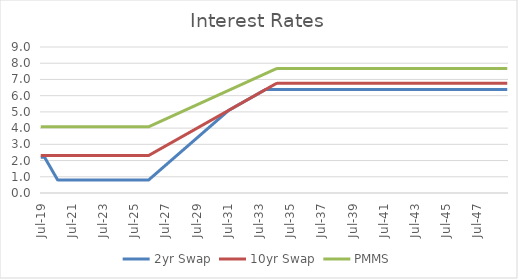
| Category | 2yr Swap | 10yr Swap | PMMS |
|---|---|---|---|
| 2019-07-31 | 2.207 | 2.308 | 4.08 |
| 2019-08-31 | 2.207 | 2.308 | 4.08 |
| 2019-09-30 | 2.207 | 2.308 | 4.08 |
| 2019-10-31 | 2.207 | 2.308 | 4.08 |
| 2019-11-30 | 2.068 | 2.308 | 4.08 |
| 2019-12-31 | 1.928 | 2.308 | 4.08 |
| 2020-01-31 | 1.789 | 2.308 | 4.08 |
| 2020-02-29 | 1.65 | 2.308 | 4.08 |
| 2020-03-31 | 1.51 | 2.308 | 4.08 |
| 2020-04-30 | 1.371 | 2.308 | 4.079 |
| 2020-05-31 | 1.232 | 2.308 | 4.079 |
| 2020-06-30 | 1.092 | 2.308 | 4.079 |
| 2020-07-31 | 0.953 | 2.308 | 4.079 |
| 2020-08-31 | 0.814 | 2.308 | 4.079 |
| 2020-09-30 | 0.798 | 2.308 | 4.079 |
| 2020-10-31 | 0.798 | 2.308 | 4.079 |
| 2020-11-30 | 0.798 | 2.308 | 4.079 |
| 2020-12-31 | 0.798 | 2.308 | 4.079 |
| 2021-01-31 | 0.798 | 2.308 | 4.079 |
| 2021-02-28 | 0.798 | 2.308 | 4.079 |
| 2021-03-31 | 0.798 | 2.308 | 4.079 |
| 2021-04-30 | 0.798 | 2.308 | 4.079 |
| 2021-05-31 | 0.798 | 2.308 | 4.079 |
| 2021-06-30 | 0.798 | 2.308 | 4.079 |
| 2021-07-31 | 0.798 | 2.308 | 4.079 |
| 2021-08-31 | 0.798 | 2.308 | 4.079 |
| 2021-09-30 | 0.798 | 2.308 | 4.079 |
| 2021-10-31 | 0.798 | 2.308 | 4.079 |
| 2021-11-30 | 0.798 | 2.308 | 4.079 |
| 2021-12-31 | 0.798 | 2.308 | 4.079 |
| 2022-01-31 | 0.798 | 2.308 | 4.079 |
| 2022-02-28 | 0.798 | 2.308 | 4.079 |
| 2022-03-31 | 0.798 | 2.308 | 4.079 |
| 2022-04-30 | 0.798 | 2.308 | 4.079 |
| 2022-05-31 | 0.798 | 2.308 | 4.079 |
| 2022-06-30 | 0.798 | 2.308 | 4.079 |
| 2022-07-31 | 0.798 | 2.308 | 4.079 |
| 2022-08-31 | 0.798 | 2.308 | 4.079 |
| 2022-09-30 | 0.798 | 2.308 | 4.079 |
| 2022-10-31 | 0.798 | 2.308 | 4.079 |
| 2022-11-30 | 0.798 | 2.308 | 4.079 |
| 2022-12-31 | 0.798 | 2.308 | 4.079 |
| 2023-01-31 | 0.798 | 2.308 | 4.079 |
| 2023-02-28 | 0.798 | 2.308 | 4.079 |
| 2023-03-31 | 0.798 | 2.308 | 4.079 |
| 2023-04-30 | 0.798 | 2.308 | 4.079 |
| 2023-05-31 | 0.798 | 2.308 | 4.079 |
| 2023-06-30 | 0.798 | 2.308 | 4.079 |
| 2023-07-31 | 0.798 | 2.308 | 4.079 |
| 2023-08-31 | 0.798 | 2.308 | 4.079 |
| 2023-09-30 | 0.798 | 2.308 | 4.079 |
| 2023-10-31 | 0.798 | 2.308 | 4.079 |
| 2023-11-30 | 0.798 | 2.308 | 4.079 |
| 2023-12-31 | 0.798 | 2.308 | 4.079 |
| 2024-01-31 | 0.798 | 2.308 | 4.079 |
| 2024-02-29 | 0.798 | 2.308 | 4.079 |
| 2024-03-31 | 0.798 | 2.308 | 4.079 |
| 2024-04-30 | 0.798 | 2.308 | 4.079 |
| 2024-05-31 | 0.798 | 2.308 | 4.079 |
| 2024-06-30 | 0.798 | 2.308 | 4.079 |
| 2024-07-31 | 0.798 | 2.308 | 4.079 |
| 2024-08-31 | 0.798 | 2.308 | 4.079 |
| 2024-09-30 | 0.798 | 2.308 | 4.079 |
| 2024-10-31 | 0.798 | 2.308 | 4.079 |
| 2024-11-30 | 0.798 | 2.308 | 4.079 |
| 2024-12-31 | 0.798 | 2.308 | 4.079 |
| 2025-01-31 | 0.798 | 2.308 | 4.079 |
| 2025-02-28 | 0.798 | 2.308 | 4.079 |
| 2025-03-31 | 0.798 | 2.308 | 4.079 |
| 2025-04-30 | 0.798 | 2.308 | 4.079 |
| 2025-05-31 | 0.798 | 2.308 | 4.079 |
| 2025-06-30 | 0.798 | 2.308 | 4.079 |
| 2025-07-31 | 0.798 | 2.308 | 4.079 |
| 2025-08-31 | 0.798 | 2.308 | 4.079 |
| 2025-09-30 | 0.798 | 2.308 | 4.079 |
| 2025-10-31 | 0.798 | 2.308 | 4.079 |
| 2025-11-30 | 0.798 | 2.308 | 4.079 |
| 2025-12-31 | 0.798 | 2.308 | 4.079 |
| 2026-01-31 | 0.798 | 2.308 | 4.079 |
| 2026-02-28 | 0.798 | 2.308 | 4.079 |
| 2026-03-31 | 0.798 | 2.308 | 4.079 |
| 2026-04-30 | 0.798 | 2.308 | 4.079 |
| 2026-05-31 | 0.798 | 2.308 | 4.079 |
| 2026-06-30 | 0.798 | 2.308 | 4.079 |
| 2026-07-31 | 0.868 | 2.353 | 4.115 |
| 2026-08-31 | 0.938 | 2.398 | 4.152 |
| 2026-09-30 | 1.007 | 2.444 | 4.188 |
| 2026-10-31 | 1.077 | 2.489 | 4.225 |
| 2026-11-30 | 1.147 | 2.534 | 4.261 |
| 2026-12-31 | 1.216 | 2.579 | 4.298 |
| 2027-01-31 | 1.286 | 2.625 | 4.334 |
| 2027-02-28 | 1.356 | 2.67 | 4.371 |
| 2027-03-31 | 1.425 | 2.715 | 4.407 |
| 2027-04-30 | 1.495 | 2.76 | 4.444 |
| 2027-05-31 | 1.565 | 2.805 | 4.48 |
| 2027-06-30 | 1.634 | 2.851 | 4.517 |
| 2027-07-31 | 1.704 | 2.896 | 4.553 |
| 2027-08-31 | 1.774 | 2.941 | 4.59 |
| 2027-09-30 | 1.843 | 2.986 | 4.626 |
| 2027-10-31 | 1.913 | 3.032 | 4.663 |
| 2027-11-30 | 1.983 | 3.077 | 4.699 |
| 2027-12-31 | 2.052 | 3.122 | 4.736 |
| 2028-01-31 | 2.122 | 3.167 | 4.772 |
| 2028-02-29 | 2.192 | 3.212 | 4.809 |
| 2028-03-31 | 2.261 | 3.258 | 4.845 |
| 2028-04-30 | 2.331 | 3.303 | 4.882 |
| 2028-05-31 | 2.401 | 3.348 | 4.918 |
| 2028-06-30 | 2.47 | 3.393 | 4.954 |
| 2028-07-31 | 2.54 | 3.439 | 4.991 |
| 2028-08-31 | 2.61 | 3.484 | 5.027 |
| 2028-09-30 | 2.679 | 3.529 | 5.064 |
| 2028-10-31 | 2.749 | 3.574 | 5.1 |
| 2028-11-30 | 2.819 | 3.619 | 5.137 |
| 2028-12-31 | 2.888 | 3.665 | 5.173 |
| 2029-01-31 | 2.958 | 3.71 | 5.21 |
| 2029-02-28 | 3.028 | 3.755 | 5.246 |
| 2029-03-31 | 3.097 | 3.8 | 5.283 |
| 2029-04-30 | 3.167 | 3.846 | 5.319 |
| 2029-05-31 | 3.237 | 3.891 | 5.356 |
| 2029-06-30 | 3.306 | 3.936 | 5.392 |
| 2029-07-31 | 3.376 | 3.981 | 5.429 |
| 2029-08-31 | 3.446 | 4.026 | 5.465 |
| 2029-09-30 | 3.515 | 4.072 | 5.502 |
| 2029-10-31 | 3.585 | 4.117 | 5.538 |
| 2029-11-30 | 3.655 | 4.162 | 5.575 |
| 2029-12-31 | 3.724 | 4.207 | 5.611 |
| 2030-01-31 | 3.794 | 4.253 | 5.648 |
| 2030-02-28 | 3.864 | 4.298 | 5.684 |
| 2030-03-31 | 3.933 | 4.343 | 5.721 |
| 2030-04-30 | 4.003 | 4.388 | 5.757 |
| 2030-05-31 | 4.073 | 4.433 | 5.794 |
| 2030-06-30 | 4.142 | 4.479 | 5.83 |
| 2030-07-31 | 4.212 | 4.524 | 5.866 |
| 2030-08-31 | 4.282 | 4.569 | 5.903 |
| 2030-09-30 | 4.351 | 4.614 | 5.939 |
| 2030-10-31 | 4.421 | 4.66 | 5.976 |
| 2030-11-30 | 4.491 | 4.705 | 6.012 |
| 2030-12-31 | 4.56 | 4.75 | 6.049 |
| 2031-01-31 | 4.63 | 4.795 | 6.085 |
| 2031-02-28 | 4.7 | 4.84 | 6.122 |
| 2031-03-31 | 4.769 | 4.886 | 6.158 |
| 2031-04-30 | 4.839 | 4.931 | 6.195 |
| 2031-05-31 | 4.909 | 4.976 | 6.231 |
| 2031-06-30 | 4.978 | 5.021 | 6.268 |
| 2031-07-31 | 5.048 | 5.066 | 6.304 |
| 2031-08-31 | 5.112 | 5.112 | 6.341 |
| 2031-09-30 | 5.157 | 5.157 | 6.377 |
| 2031-10-31 | 5.202 | 5.202 | 6.414 |
| 2031-11-30 | 5.247 | 5.247 | 6.45 |
| 2031-12-31 | 5.293 | 5.293 | 6.487 |
| 2032-01-31 | 5.338 | 5.338 | 6.523 |
| 2032-02-29 | 5.383 | 5.383 | 6.56 |
| 2032-03-31 | 5.428 | 5.428 | 6.596 |
| 2032-04-30 | 5.473 | 5.473 | 6.632 |
| 2032-05-31 | 5.519 | 5.519 | 6.669 |
| 2032-06-30 | 5.564 | 5.564 | 6.705 |
| 2032-07-31 | 5.609 | 5.609 | 6.742 |
| 2032-08-31 | 5.654 | 5.654 | 6.778 |
| 2032-09-30 | 5.7 | 5.7 | 6.815 |
| 2032-10-31 | 5.745 | 5.745 | 6.851 |
| 2032-11-30 | 5.79 | 5.79 | 6.888 |
| 2032-12-31 | 5.835 | 5.835 | 6.924 |
| 2033-01-31 | 5.88 | 5.88 | 6.961 |
| 2033-02-28 | 5.926 | 5.926 | 6.997 |
| 2033-03-31 | 5.971 | 5.971 | 7.034 |
| 2033-04-30 | 6.016 | 6.016 | 7.07 |
| 2033-05-31 | 6.061 | 6.061 | 7.106 |
| 2033-06-30 | 6.107 | 6.107 | 7.143 |
| 2033-07-31 | 6.152 | 6.152 | 7.179 |
| 2033-08-31 | 6.197 | 6.197 | 7.216 |
| 2033-09-30 | 6.242 | 6.242 | 7.252 |
| 2033-10-31 | 6.287 | 6.287 | 7.289 |
| 2033-11-30 | 6.333 | 6.333 | 7.325 |
| 2033-12-31 | 6.378 | 6.378 | 7.362 |
| 2034-01-31 | 6.387 | 6.423 | 7.398 |
| 2034-02-28 | 6.387 | 6.468 | 7.435 |
| 2034-03-31 | 6.387 | 6.514 | 7.471 |
| 2034-04-30 | 6.387 | 6.559 | 7.507 |
| 2034-05-31 | 6.387 | 6.604 | 7.544 |
| 2034-06-30 | 6.387 | 6.649 | 7.58 |
| 2034-07-31 | 6.387 | 6.694 | 7.617 |
| 2034-08-31 | 6.387 | 6.74 | 7.653 |
| 2034-09-30 | 6.387 | 6.758 | 7.668 |
| 2034-10-31 | 6.387 | 6.758 | 7.668 |
| 2034-11-30 | 6.387 | 6.758 | 7.668 |
| 2034-12-31 | 6.387 | 6.758 | 7.668 |
| 2035-01-31 | 6.387 | 6.758 | 7.668 |
| 2035-02-28 | 6.387 | 6.758 | 7.668 |
| 2035-03-31 | 6.387 | 6.758 | 7.668 |
| 2035-04-30 | 6.387 | 6.758 | 7.668 |
| 2035-05-31 | 6.387 | 6.758 | 7.668 |
| 2035-06-30 | 6.387 | 6.758 | 7.668 |
| 2035-07-31 | 6.387 | 6.758 | 7.668 |
| 2035-08-31 | 6.387 | 6.758 | 7.668 |
| 2035-09-30 | 6.387 | 6.758 | 7.668 |
| 2035-10-31 | 6.387 | 6.758 | 7.668 |
| 2035-11-30 | 6.387 | 6.758 | 7.668 |
| 2035-12-31 | 6.387 | 6.758 | 7.668 |
| 2036-01-31 | 6.387 | 6.758 | 7.668 |
| 2036-02-29 | 6.387 | 6.758 | 7.668 |
| 2036-03-31 | 6.387 | 6.758 | 7.668 |
| 2036-04-30 | 6.387 | 6.758 | 7.668 |
| 2036-05-31 | 6.387 | 6.758 | 7.668 |
| 2036-06-30 | 6.387 | 6.758 | 7.668 |
| 2036-07-31 | 6.387 | 6.758 | 7.668 |
| 2036-08-31 | 6.387 | 6.758 | 7.668 |
| 2036-09-30 | 6.387 | 6.758 | 7.668 |
| 2036-10-31 | 6.387 | 6.758 | 7.668 |
| 2036-11-30 | 6.387 | 6.758 | 7.668 |
| 2036-12-31 | 6.387 | 6.758 | 7.668 |
| 2037-01-31 | 6.387 | 6.758 | 7.668 |
| 2037-02-28 | 6.387 | 6.758 | 7.668 |
| 2037-03-31 | 6.387 | 6.758 | 7.668 |
| 2037-04-30 | 6.387 | 6.758 | 7.668 |
| 2037-05-31 | 6.387 | 6.758 | 7.668 |
| 2037-06-30 | 6.387 | 6.758 | 7.668 |
| 2037-07-31 | 6.387 | 6.758 | 7.668 |
| 2037-08-31 | 6.387 | 6.758 | 7.668 |
| 2037-09-30 | 6.387 | 6.758 | 7.668 |
| 2037-10-31 | 6.387 | 6.758 | 7.668 |
| 2037-11-30 | 6.387 | 6.758 | 7.668 |
| 2037-12-31 | 6.387 | 6.758 | 7.668 |
| 2038-01-31 | 6.387 | 6.758 | 7.668 |
| 2038-02-28 | 6.387 | 6.758 | 7.668 |
| 2038-03-31 | 6.387 | 6.758 | 7.668 |
| 2038-04-30 | 6.387 | 6.758 | 7.668 |
| 2038-05-31 | 6.387 | 6.758 | 7.668 |
| 2038-06-30 | 6.387 | 6.758 | 7.668 |
| 2038-07-31 | 6.387 | 6.758 | 7.668 |
| 2038-08-31 | 6.387 | 6.758 | 7.668 |
| 2038-09-30 | 6.387 | 6.758 | 7.668 |
| 2038-10-31 | 6.387 | 6.758 | 7.668 |
| 2038-11-30 | 6.387 | 6.758 | 7.668 |
| 2038-12-31 | 6.387 | 6.758 | 7.668 |
| 2039-01-31 | 6.387 | 6.758 | 7.668 |
| 2039-02-28 | 6.387 | 6.758 | 7.668 |
| 2039-03-31 | 6.387 | 6.758 | 7.668 |
| 2039-04-30 | 6.387 | 6.758 | 7.668 |
| 2039-05-31 | 6.387 | 6.758 | 7.668 |
| 2039-06-30 | 6.387 | 6.758 | 7.668 |
| 2039-07-31 | 6.387 | 6.758 | 7.668 |
| 2039-08-31 | 6.387 | 6.758 | 7.668 |
| 2039-09-30 | 6.387 | 6.758 | 7.668 |
| 2039-10-31 | 6.387 | 6.758 | 7.668 |
| 2039-11-30 | 6.387 | 6.758 | 7.668 |
| 2039-12-31 | 6.387 | 6.758 | 7.668 |
| 2040-01-31 | 6.387 | 6.758 | 7.668 |
| 2040-02-29 | 6.387 | 6.758 | 7.668 |
| 2040-03-31 | 6.387 | 6.758 | 7.668 |
| 2040-04-30 | 6.387 | 6.758 | 7.668 |
| 2040-05-31 | 6.387 | 6.758 | 7.668 |
| 2040-06-30 | 6.387 | 6.758 | 7.668 |
| 2040-07-31 | 6.387 | 6.758 | 7.668 |
| 2040-08-31 | 6.387 | 6.758 | 7.668 |
| 2040-09-30 | 6.387 | 6.758 | 7.668 |
| 2040-10-31 | 6.387 | 6.758 | 7.668 |
| 2040-11-30 | 6.387 | 6.758 | 7.668 |
| 2040-12-31 | 6.387 | 6.758 | 7.668 |
| 2041-01-31 | 6.387 | 6.758 | 7.668 |
| 2041-02-28 | 6.387 | 6.758 | 7.668 |
| 2041-03-31 | 6.387 | 6.758 | 7.668 |
| 2041-04-30 | 6.387 | 6.758 | 7.668 |
| 2041-05-31 | 6.387 | 6.758 | 7.668 |
| 2041-06-30 | 6.387 | 6.758 | 7.668 |
| 2041-07-31 | 6.387 | 6.758 | 7.668 |
| 2041-08-31 | 6.387 | 6.758 | 7.668 |
| 2041-09-30 | 6.387 | 6.758 | 7.668 |
| 2041-10-31 | 6.387 | 6.758 | 7.668 |
| 2041-11-30 | 6.387 | 6.758 | 7.668 |
| 2041-12-31 | 6.387 | 6.758 | 7.668 |
| 2042-01-31 | 6.387 | 6.758 | 7.668 |
| 2042-02-28 | 6.387 | 6.758 | 7.668 |
| 2042-03-31 | 6.387 | 6.758 | 7.668 |
| 2042-04-30 | 6.387 | 6.758 | 7.668 |
| 2042-05-31 | 6.387 | 6.758 | 7.668 |
| 2042-06-30 | 6.387 | 6.758 | 7.668 |
| 2042-07-31 | 6.387 | 6.758 | 7.668 |
| 2042-08-31 | 6.387 | 6.758 | 7.668 |
| 2042-09-30 | 6.387 | 6.758 | 7.668 |
| 2042-10-31 | 6.387 | 6.758 | 7.668 |
| 2042-11-30 | 6.387 | 6.758 | 7.668 |
| 2042-12-31 | 6.387 | 6.758 | 7.668 |
| 2043-01-31 | 6.387 | 6.758 | 7.668 |
| 2043-02-28 | 6.387 | 6.758 | 7.668 |
| 2043-03-31 | 6.387 | 6.758 | 7.668 |
| 2043-04-30 | 6.387 | 6.758 | 7.668 |
| 2043-05-31 | 6.387 | 6.758 | 7.668 |
| 2043-06-30 | 6.387 | 6.758 | 7.668 |
| 2043-07-31 | 6.387 | 6.758 | 7.668 |
| 2043-08-31 | 6.387 | 6.758 | 7.668 |
| 2043-09-30 | 6.387 | 6.758 | 7.668 |
| 2043-10-31 | 6.387 | 6.758 | 7.668 |
| 2043-11-30 | 6.387 | 6.758 | 7.668 |
| 2043-12-31 | 6.387 | 6.758 | 7.668 |
| 2044-01-31 | 6.387 | 6.758 | 7.668 |
| 2044-02-29 | 6.387 | 6.758 | 7.668 |
| 2044-03-31 | 6.387 | 6.758 | 7.668 |
| 2044-04-30 | 6.387 | 6.758 | 7.668 |
| 2044-05-31 | 6.387 | 6.758 | 7.668 |
| 2044-06-30 | 6.387 | 6.758 | 7.668 |
| 2044-07-31 | 6.387 | 6.758 | 7.668 |
| 2044-08-31 | 6.387 | 6.758 | 7.668 |
| 2044-09-30 | 6.387 | 6.758 | 7.668 |
| 2044-10-31 | 6.387 | 6.758 | 7.668 |
| 2044-11-30 | 6.387 | 6.758 | 7.668 |
| 2044-12-31 | 6.387 | 6.758 | 7.668 |
| 2045-01-31 | 6.387 | 6.758 | 7.668 |
| 2045-02-28 | 6.387 | 6.758 | 7.668 |
| 2045-03-31 | 6.387 | 6.758 | 7.668 |
| 2045-04-30 | 6.387 | 6.758 | 7.668 |
| 2045-05-31 | 6.387 | 6.758 | 7.668 |
| 2045-06-30 | 6.387 | 6.758 | 7.668 |
| 2045-07-31 | 6.387 | 6.758 | 7.668 |
| 2045-08-31 | 6.387 | 6.758 | 7.668 |
| 2045-09-30 | 6.387 | 6.758 | 7.668 |
| 2045-10-31 | 6.387 | 6.758 | 7.668 |
| 2045-11-30 | 6.387 | 6.758 | 7.668 |
| 2045-12-31 | 6.387 | 6.758 | 7.668 |
| 2046-01-31 | 6.387 | 6.758 | 7.668 |
| 2046-02-28 | 6.387 | 6.758 | 7.668 |
| 2046-03-31 | 6.387 | 6.758 | 7.668 |
| 2046-04-30 | 6.387 | 6.758 | 7.668 |
| 2046-05-31 | 6.387 | 6.758 | 7.668 |
| 2046-06-30 | 6.387 | 6.758 | 7.668 |
| 2046-07-31 | 6.387 | 6.758 | 7.668 |
| 2046-08-31 | 6.387 | 6.758 | 7.668 |
| 2046-09-30 | 6.387 | 6.758 | 7.668 |
| 2046-10-31 | 6.387 | 6.758 | 7.668 |
| 2046-11-30 | 6.387 | 6.758 | 7.668 |
| 2046-12-31 | 6.387 | 6.758 | 7.668 |
| 2047-01-31 | 6.387 | 6.758 | 7.668 |
| 2047-02-28 | 6.387 | 6.758 | 7.668 |
| 2047-03-31 | 6.387 | 6.758 | 7.668 |
| 2047-04-30 | 6.387 | 6.758 | 7.668 |
| 2047-05-31 | 6.387 | 6.758 | 7.668 |
| 2047-06-30 | 6.387 | 6.758 | 7.668 |
| 2047-07-31 | 6.387 | 6.758 | 7.668 |
| 2047-08-31 | 6.387 | 6.758 | 7.668 |
| 2047-09-30 | 6.387 | 6.758 | 7.668 |
| 2047-10-31 | 6.387 | 6.758 | 7.668 |
| 2047-11-30 | 6.387 | 6.758 | 7.668 |
| 2047-12-31 | 6.387 | 6.758 | 7.668 |
| 2048-01-31 | 6.387 | 6.758 | 7.668 |
| 2048-02-29 | 6.387 | 6.758 | 7.668 |
| 2048-03-31 | 6.387 | 6.758 | 7.668 |
| 2048-04-30 | 6.387 | 6.758 | 7.668 |
| 2048-05-31 | 6.387 | 6.758 | 7.668 |
| 2048-06-30 | 6.387 | 6.758 | 7.668 |
| 2048-07-31 | 6.387 | 6.758 | 7.668 |
| 2048-08-31 | 6.387 | 6.758 | 7.668 |
| 2048-09-30 | 6.387 | 6.758 | 7.668 |
| 2048-10-31 | 6.387 | 6.758 | 7.668 |
| 2048-11-30 | 6.387 | 6.758 | 7.668 |
| 2048-12-31 | 6.387 | 6.758 | 7.668 |
| 2049-01-31 | 6.387 | 6.758 | 7.668 |
| 2049-02-28 | 6.387 | 6.758 | 7.668 |
| 2049-03-31 | 6.387 | 6.758 | 7.668 |
| 2049-04-30 | 6.387 | 6.758 | 7.668 |
| 2049-05-31 | 6.387 | 6.758 | 7.668 |
| 2049-06-30 | 6.387 | 6.758 | 7.668 |